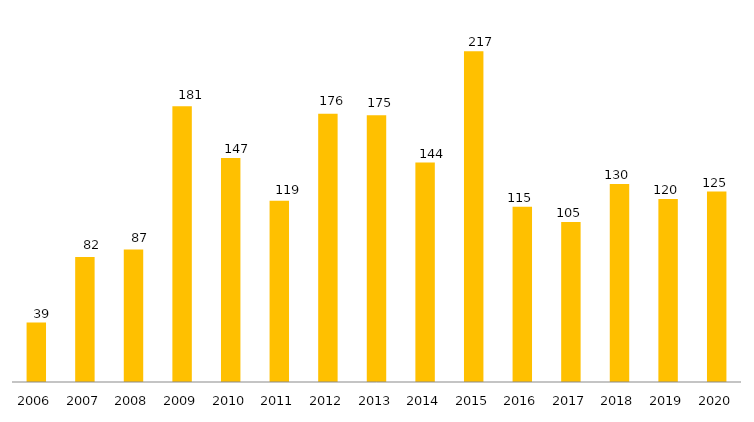
| Category | Series 1 |
|---|---|
| 2006.0 | 39 |
| 2007.0 | 82 |
| 2008.0 | 87 |
| 2009.0 | 181 |
| 2010.0 | 147 |
| 2011.0 | 119 |
| 2012.0 | 176 |
| 2013.0 | 175 |
| 2014.0 | 144 |
| 2015.0 | 217 |
| 2016.0 | 115 |
| 2017.0 | 105 |
| 2018.0 | 130 |
| 2019.0 | 120 |
| 2020.0 | 125 |